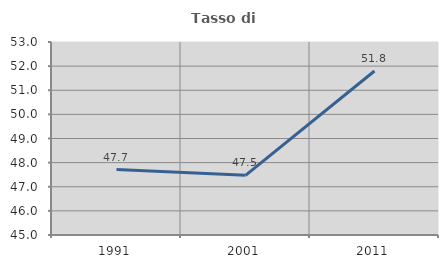
| Category | Tasso di occupazione   |
|---|---|
| 1991.0 | 47.714 |
| 2001.0 | 47.473 |
| 2011.0 | 51.797 |